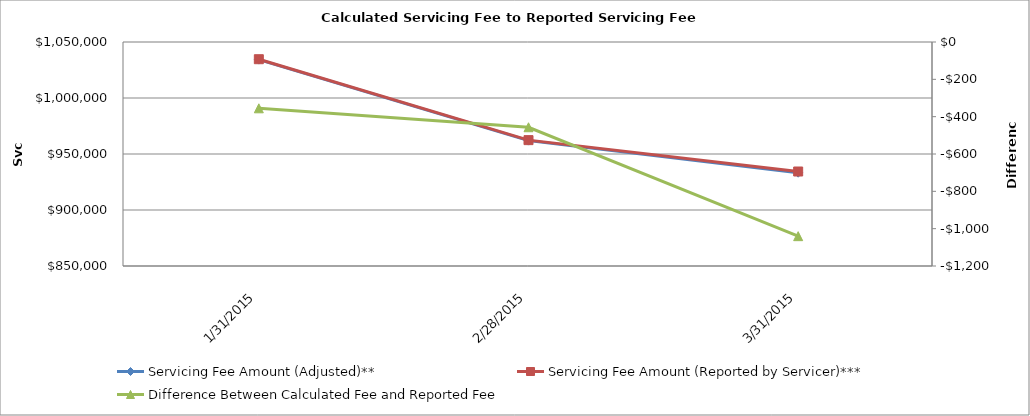
| Category | Servicing Fee Amount (Adjusted)** | Servicing Fee Amount (Reported by Servicer)*** |
|---|---|---|
| 1/31/15 | 1034279.32 | 1034634.5 |
| 2/28/15 | 961929.74 | 962386.4 |
| 3/31/15 | 933324.96 | 934365.13 |